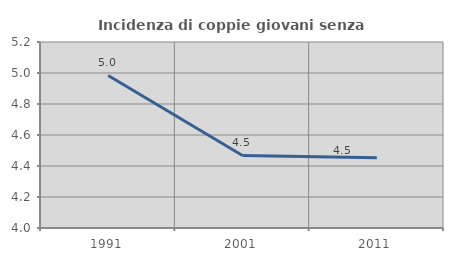
| Category | Incidenza di coppie giovani senza figli |
|---|---|
| 1991.0 | 4.984 |
| 2001.0 | 4.468 |
| 2011.0 | 4.453 |